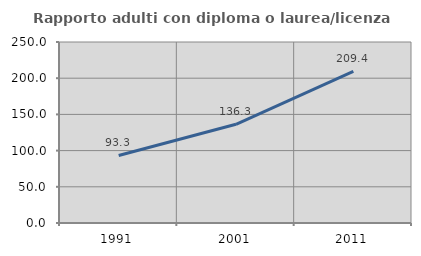
| Category | Rapporto adulti con diploma o laurea/licenza media  |
|---|---|
| 1991.0 | 93.297 |
| 2001.0 | 136.329 |
| 2011.0 | 209.414 |